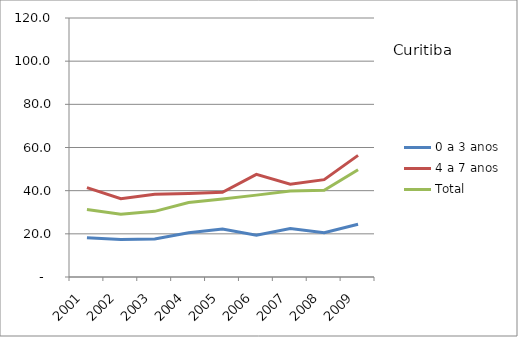
| Category | 0 a 3 anos | 4 a 7 anos | Total |
|---|---|---|---|
| 2001.0 | 18.24 | 41.44 | 31.25 |
| 2002.0 | 17.38 | 36.29 | 29.13 |
| 2003.0 | 17.6 | 38.34 | 30.42 |
| 2004.0 | 20.47 | 38.66 | 34.53 |
| 2005.0 | 22.2 | 39.23 | 36.11 |
| 2006.0 | 19.31 | 47.54 | 37.93 |
| 2007.0 | 22.49 | 43.03 | 39.86 |
| 2008.0 | 20.51 | 45.12 | 40.14 |
| 2009.0 | 24.45 | 56.36 | 49.67 |